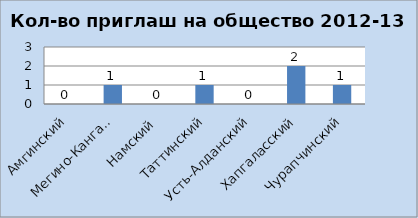
| Category | Series 0 |
|---|---|
| Амгинский | 0 |
| Мегино-Кангаласский | 1 |
| Намский | 0 |
| Таттинский | 1 |
| Усть-Алданский | 0 |
| Хапгаласский | 2 |
| Чурапчинский | 1 |